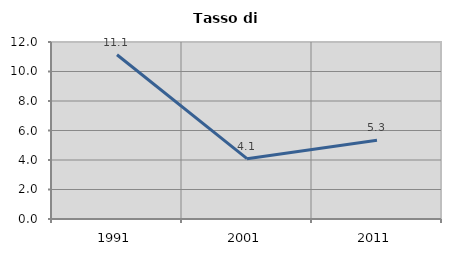
| Category | Tasso di disoccupazione   |
|---|---|
| 1991.0 | 11.138 |
| 2001.0 | 4.089 |
| 2011.0 | 5.335 |